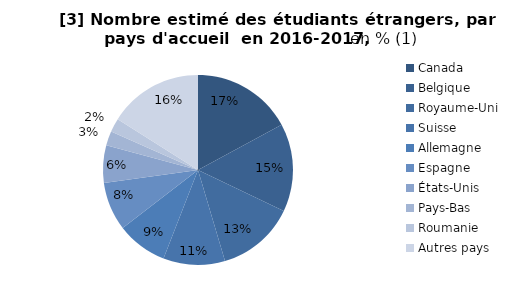
| Category | [3] Répartition estimée des étudiants étrangers, par pays d'accueil en 2017-2018, en % (1) |
|---|---|
| Canada | 17.117 |
| Belgique | 14.962 |
| Royaume-Uni  | 13.333 |
| Suisse | 10.501 |
| Allemagne | 8.649 |
| Espagne | 8.262 |
| États-Unis  | 6.357 |
| Pays-Bas | 2.438 |
| Roumanie | 2.362 |
| Autres pays | 16.018 |